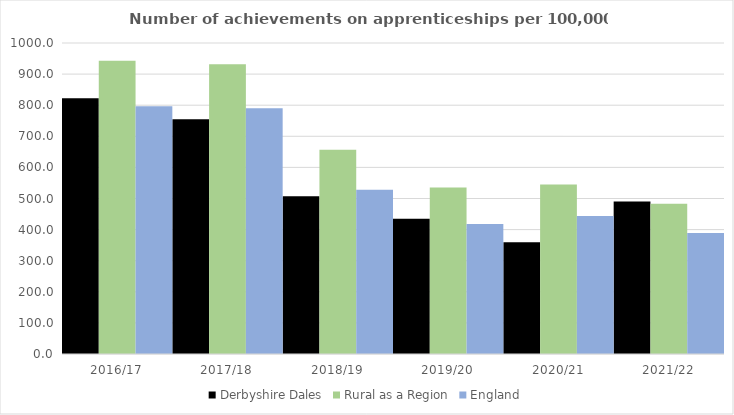
| Category | Derbyshire Dales | Rural as a Region | England |
|---|---|---|---|
| 2016/17 | 822 | 942.594 | 797 |
| 2017/18 | 755 | 931.709 | 790 |
| 2018/19 | 507 | 656.44 | 528 |
| 2019/20 | 435 | 535.552 | 418 |
| 2020/21 | 359 | 545.333 | 444 |
| 2021/22 | 490 | 482.936 | 389 |